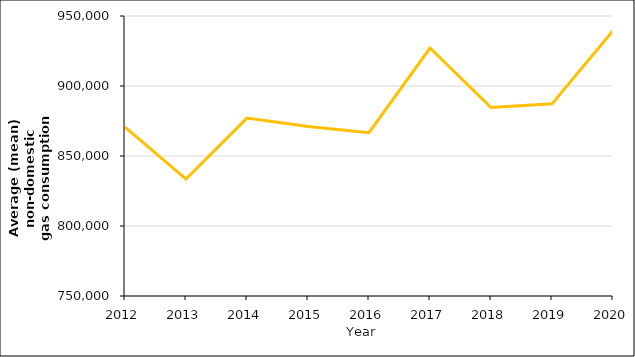
| Category | Mean Non-domestic Consumption (kWh) |
|---|---|
| 2012.0 | 870658 |
| 2013.0 | 833518 |
| 2014.0 | 877067.085 |
| 2015.0 | 871109.166 |
| 2016.0 | 866695.948 |
| 2017.0 | 927122.979 |
| 2018.0 | 884646.086 |
| 2019.0 | 887237.657 |
| 2020.0 | 939493.386 |